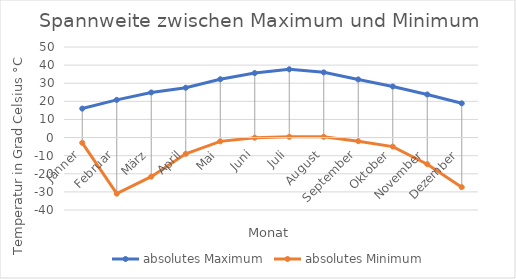
| Category | absolutes Maximum | absolutes Minimum |
|---|---|---|
| Jänner | 16 | -2.9 |
| Februar | 20.8 | -31 |
| März | 24.9 | -21.6 |
| April | 27.5 | -9 |
| Mai | 32.2 | -2.1 |
| Juni | 35.6 | -0.1 |
| Juli | 37.7 | 0.4 |
| August | 36 | 0.4 |
| September | 32.1 | -2 |
| Oktober | 28.2 | -5 |
| November | 23.8 | -14.7 |
| Dezember | 18.9 | -27.4 |